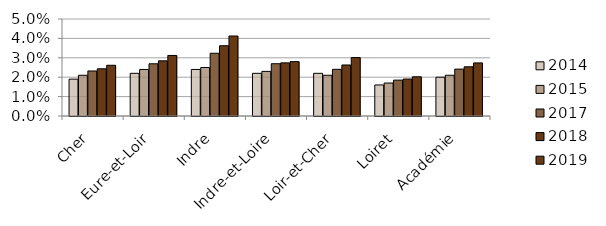
| Category | 2014 | 2015 | 2017 | 2018 | 2019 |
|---|---|---|---|---|---|
| Cher | 0.019 | 0.021 | 0.023 | 0.024 | 0.026 |
| Eure-et-Loir | 0.022 | 0.024 | 0.027 | 0.028 | 0.031 |
| Indre | 0.024 | 0.025 | 0.032 | 0.036 | 0.041 |
| Indre-et-Loire | 0.022 | 0.023 | 0.027 | 0.027 | 0.028 |
| Loir-et-Cher | 0.022 | 0.021 | 0.024 | 0.026 | 0.03 |
| Loiret | 0.016 | 0.017 | 0.018 | 0.019 | 0.02 |
| Académie | 0.02 | 0.021 | 0.024 | 0.025 | 0.027 |